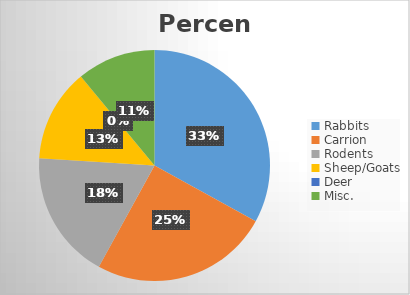
| Category | Percent |
|---|---|
| Rabbits | 0.33 |
| Carrion | 0.25 |
| Rodents | 0.18 |
| Sheep/Goats | 0.13 |
| Deer | 0 |
| Misc. | 0.11 |